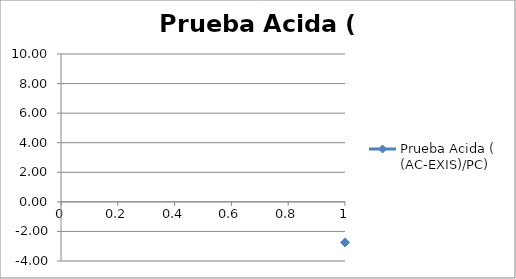
| Category | Prueba Acida ( (AC-EXIS)/PC) |
|---|---|
| 0 | -2.743 |
| 1 | 4.443 |
| 2 | 4.94 |
| 3 | 4.681 |
| 4 | 2.649 |
| 5 | 7.864 |
| 6 | 6.895 |
| 7 | 0.5 |